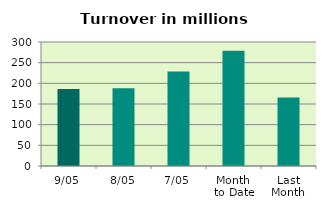
| Category | Series 0 |
|---|---|
| 9/05 | 186.185 |
| 8/05 | 188.008 |
| 7/05 | 228.722 |
| Month 
to Date | 279.025 |
| Last
Month | 165.638 |